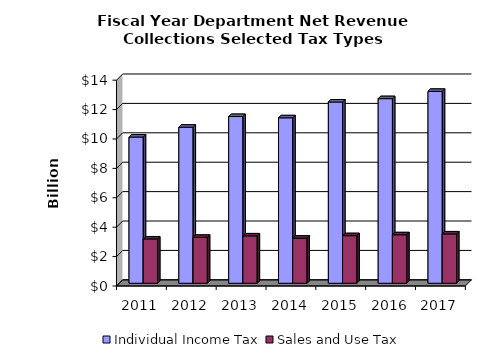
| Category | Individual Income Tax | Sales and Use Tax |
|---|---|---|
| 2011.0 | 9.944 | 3.012 |
| 2012.0 | 10.613 | 3.122 |
| 2013.0 | 11.34 | 3.22 |
| 2014.0 | 11.253 | 3.066 |
| 2015.0 | 12.329 | 3.235 |
| 2016.0 | 12.556 | 3.296 |
| 2017.0 | 13.053 | 3.355 |